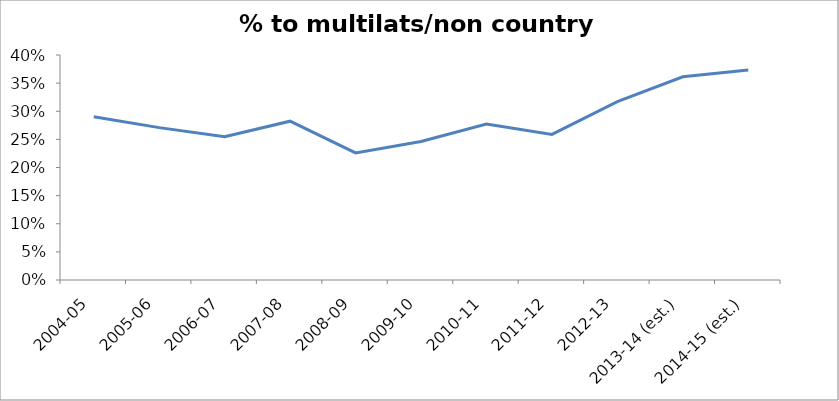
| Category | Series 0 |
|---|---|
| 2004-05 | 0.29 |
| 2005-06 | 0.271 |
| 2006-07 | 0.255 |
| 2007-08 | 0.282 |
| 2008-09 | 0.226 |
| 2009-10 | 0.246 |
| 2010-11 | 0.277 |
| 2011-12 | 0.259 |
| 2012-13 | 0.317 |
| 2013-14 (est.) | 0.361 |
| 2014-15 (est.) | 0.373 |